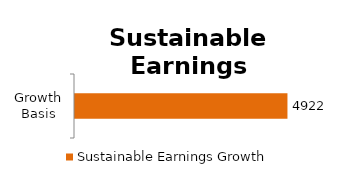
| Category | Sustainable Earnings Growth |
|---|---|
| 0 | 4921.625 |